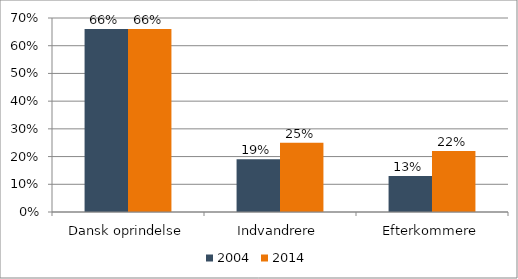
| Category | 2004 | 2014 |
|---|---|---|
| Dansk oprindelse | 0.66 | 0.66 |
| Indvandrere | 0.19 | 0.25 |
| Efterkommere | 0.13 | 0.22 |